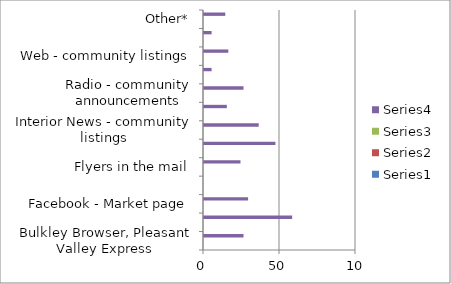
| Category | Series 0 | Series 1 | Series 2 | Series 3 |
|---|---|---|---|---|
| Bulkley Browser, Pleasant Valley Express |  |  |  | 26 |
| Facebook - friends sharing |  |  |  | 58 |
| Facebook - Market page |  |  |  | 29 |
| Twitter |  |  |  | 0 |
| Flyers in the mail |  |  |  | 24 |
| Posters |  |  |  | 47 |
| Interior News - community listings |  |  |  | 36 |
| Interior News - paid ads |  |  |  | 15 |
| Radio - community announcements |  |  |  | 26 |
| Radio - paid ads |  |  |  | 5 |
| Web - community listings |  |  |  | 16 |
| Web - Market website |  |  |  | 5 |
| Other* |  |  |  | 14 |